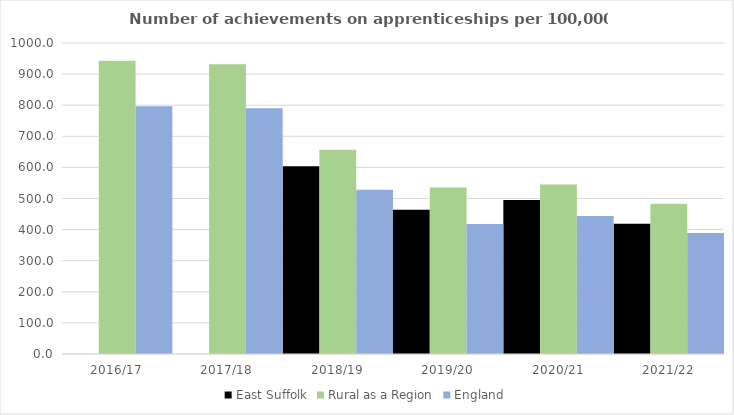
| Category | East Suffolk | Rural as a Region | England |
|---|---|---|---|
| 2016/17 | 0 | 942.594 | 797 |
| 2017/18 | 0 | 931.709 | 790 |
| 2018/19 | 604 | 656.44 | 528 |
| 2019/20 | 464 | 535.552 | 418 |
| 2020/21 | 495 | 545.333 | 444 |
| 2021/22 | 419 | 482.936 | 389 |